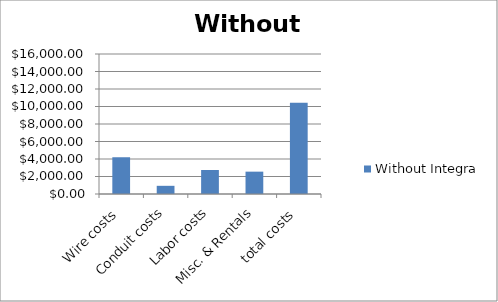
| Category | Without Integra |
|---|---|
| Wire costs | 4200 |
| Conduit costs | 935 |
| Labor costs | 2745 |
| Misc. & Rentals | 2554 |
| total costs | 10434 |